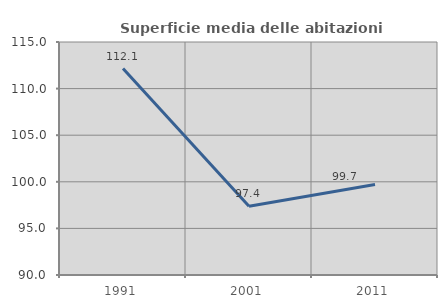
| Category | Superficie media delle abitazioni occupate |
|---|---|
| 1991.0 | 112.145 |
| 2001.0 | 97.382 |
| 2011.0 | 99.717 |